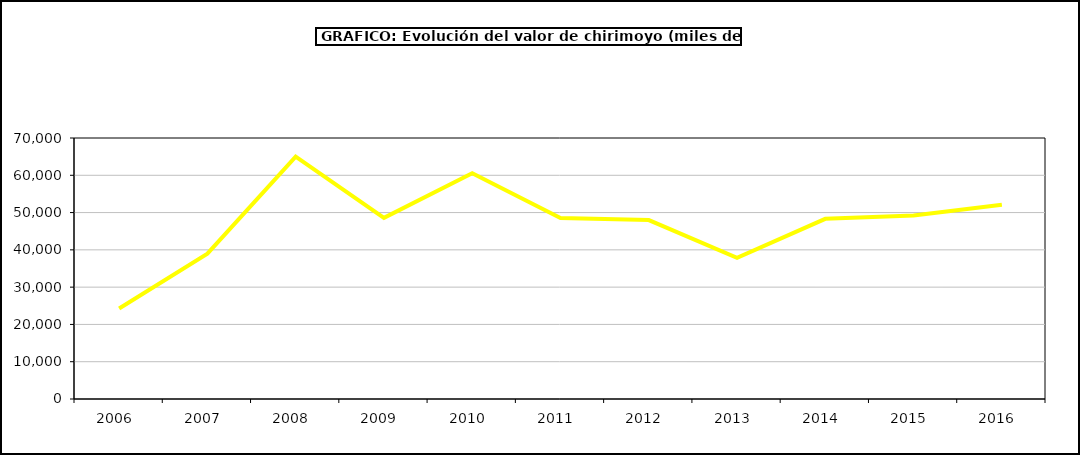
| Category | valor chirimoyo |
|---|---|
| 2006.0 | 24256.192 |
| 2007.0 | 38969.891 |
| 2008.0 | 65026.967 |
| 2009.0 | 48581.198 |
| 2010.0 | 60575.574 |
| 2011.0 | 48545.2 |
| 2012.0 | 47992.004 |
| 2013.0 | 37891.803 |
| 2014.0 | 48319.818 |
| 2015.0 | 49187 |
| 2016.0 | 52120 |